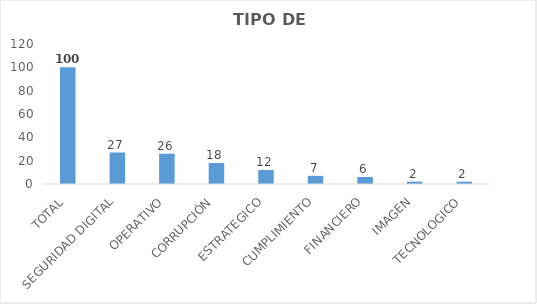
| Category | Series 0 |
|---|---|
| TOTAL | 100 |
| SEGURIDAD DIGITAL | 27 |
| OPERATIVO | 26 |
| CORRUPCIÓN | 18 |
| ESTRATEGICO | 12 |
| CUMPLIMIENTO | 7 |
| FINANCIERO | 6 |
| IMAGEN | 2 |
| TECNOLOGICO | 2 |